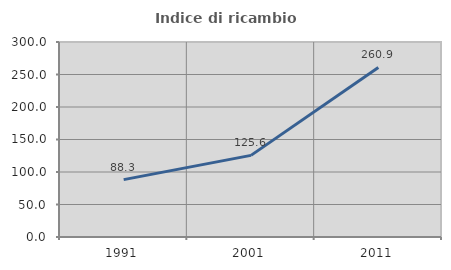
| Category | Indice di ricambio occupazionale  |
|---|---|
| 1991.0 | 88.251 |
| 2001.0 | 125.577 |
| 2011.0 | 260.907 |